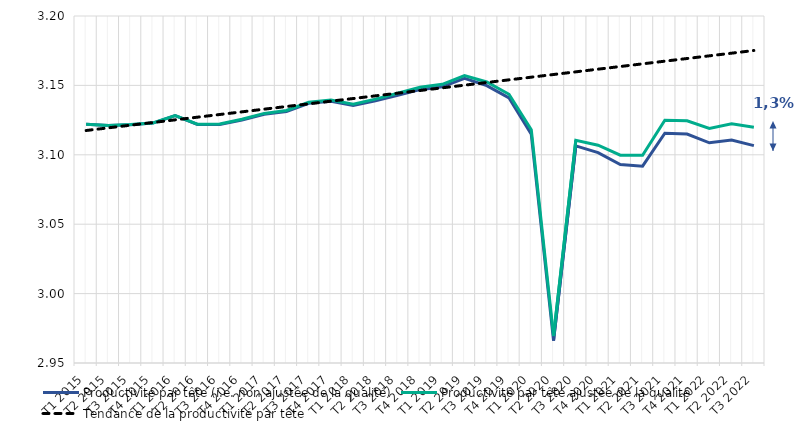
| Category | Productivité par tête (i.e. non ajustée de la qualité) | Productivité par tête ajustée de la qualité | Tendance de la productivité par tête |
|---|---|---|---|
| T1 2015 | 3.122 | 3.122 | 3.118 |
| T2 2015 | 3.121 | 3.121 | 3.119 |
| T3 2015 | 3.122 | 3.122 | 3.121 |
| T4 2015 | 3.123 | 3.123 | 3.123 |
| T1 2016 | 3.128 | 3.128 | 3.125 |
| T2 2016 | 3.122 | 3.122 | 3.127 |
| T3 2016 | 3.122 | 3.122 | 3.129 |
| T4 2016 | 3.125 | 3.126 | 3.131 |
| T1 2017 | 3.129 | 3.13 | 3.133 |
| T2 2017 | 3.131 | 3.132 | 3.135 |
| T3 2017 | 3.137 | 3.138 | 3.137 |
| T4 2017 | 3.139 | 3.139 | 3.139 |
| T1 2018 | 3.136 | 3.136 | 3.141 |
| T2 2018 | 3.139 | 3.14 | 3.142 |
| T3 2018 | 3.143 | 3.144 | 3.144 |
| T4 2018 | 3.147 | 3.149 | 3.146 |
| T1 2019 | 3.149 | 3.151 | 3.148 |
| T2 2019 | 3.155 | 3.157 | 3.15 |
| T3 2019 | 3.15 | 3.152 | 3.152 |
| T4 2019 | 3.141 | 3.144 | 3.154 |
| T1 2020 | 3.115 | 3.118 | 3.156 |
| T2 2020 | 2.966 | 2.969 | 3.158 |
| T3 2020 | 3.106 | 3.11 | 3.16 |
| T4 2020 | 3.102 | 3.107 | 3.162 |
| T1 2021 | 3.093 | 3.1 | 3.164 |
| T2 2021 | 3.092 | 3.1 | 3.166 |
| T3 2021 | 3.116 | 3.125 | 3.167 |
| T4 2021 | 3.115 | 3.125 | 3.169 |
| T1 2022 | 3.109 | 3.119 | 3.171 |
| T2 2022 | 3.111 | 3.122 | 3.173 |
| T3 2022 | 3.107 | 3.12 | 3.175 |